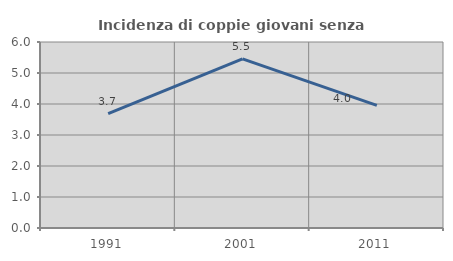
| Category | Incidenza di coppie giovani senza figli |
|---|---|
| 1991.0 | 3.686 |
| 2001.0 | 5.458 |
| 2011.0 | 3.955 |